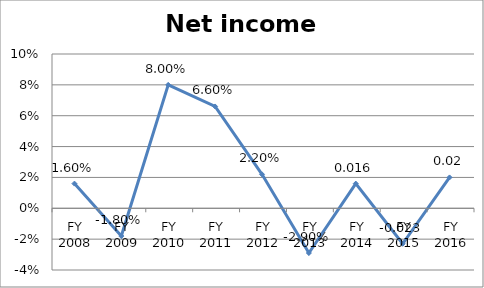
| Category | Net income ratio |
|---|---|
| FY 2016 | 0.02 |
| FY 2015 | -0.023 |
| FY 2014 | 0.016 |
| FY 2013 | -0.029 |
| FY 2012 | 0.022 |
| FY 2011 | 0.066 |
| FY 2010 | 0.08 |
| FY 2009 | -0.018 |
| FY 2008 | 0.016 |